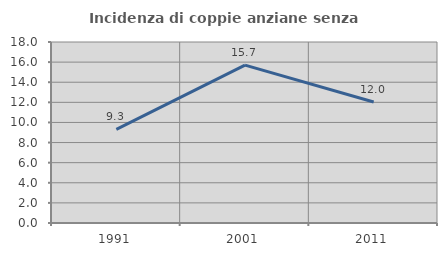
| Category | Incidenza di coppie anziane senza figli  |
|---|---|
| 1991.0 | 9.302 |
| 2001.0 | 15.702 |
| 2011.0 | 12.03 |